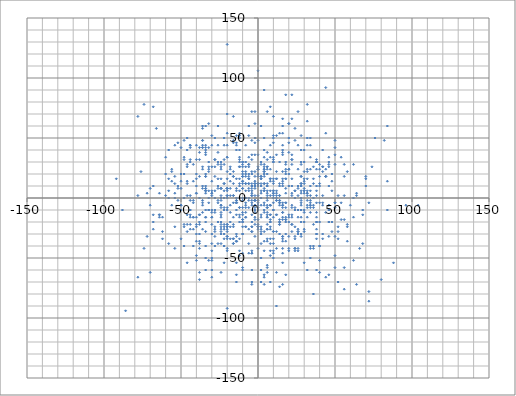
| Category | Series 0 |
|---|---|
| -16.0 | -4 |
| 6.0 | -22 |
| -34.0 | -28 |
| 16.0 | 22 |
| 2.0 | -6 |
| 26.0 | -16 |
| 6.0 | 24 |
| 46.0 | 30 |
| -32.0 | 42 |
| -38.0 | -38 |
| 0.0 | -6 |
| 16.0 | 66 |
| -30.0 | -44 |
| 30.0 | -20 |
| 2.0 | 6 |
| 24.0 | -44 |
| -72.0 | -32 |
| 16.0 | 16 |
| 28.0 | 12 |
| -20.0 | -8 |
| 50.0 | -4 |
| -30.0 | -10 |
| 14.0 | -4 |
| -2.0 | 10 |
| -10.0 | 12 |
| -20.0 | -26 |
| -40.0 | -24 |
| 22.0 | 10 |
| -8.0 | -4 |
| 4.0 | -72 |
| -20.0 | 34 |
| -8.0 | 30 |
| -2.0 | 62 |
| -8.0 | 0 |
| 28.0 | 6 |
| 36.0 | 16 |
| 8.0 | -14 |
| 16.0 | -42 |
| -34.0 | 18 |
| 8.0 | 34 |
| -8.0 | 26 |
| -58.0 | 40 |
| -46.0 | -54 |
| 16.0 | -46 |
| 40.0 | -52 |
| 24.0 | -42 |
| 52.0 | -28 |
| 18.0 | 8 |
| -28.0 | 26 |
| 38.0 | -4 |
| -14.0 | -4 |
| 8.0 | 16 |
| 4.0 | 24 |
| -34.0 | 18 |
| 70.0 | 16 |
| -10.0 | -20 |
| 18.0 | -4 |
| -14.0 | 46 |
| 4.0 | 6 |
| 2.0 | -26 |
| 28.0 | -16 |
| 16.0 | 54 |
| -2.0 | -10 |
| -46.0 | 2 |
| 38.0 | 30 |
| 18.0 | -64 |
| 8.0 | -18 |
| 38.0 | -60 |
| -12.0 | -44 |
| -58.0 | 6 |
| 24.0 | 0 |
| 28.0 | -30 |
| -46.0 | -28 |
| -10.0 | 30 |
| 34.0 | 44 |
| 20.0 | 50 |
| 4.0 | -4 |
| 50.0 | -4 |
| 46.0 | 10 |
| -62.0 | -34 |
| 10.0 | -4 |
| 16.0 | -12 |
| 14.0 | 2 |
| 50.0 | 48 |
| -38.0 | -14 |
| -20.0 | 22 |
| -2.0 | 50 |
| -20.0 | -42 |
| 54.0 | -4 |
| 30.0 | 14 |
| -26.0 | 30 |
| 14.0 | -2 |
| -6.0 | 52 |
| 30.0 | -10 |
| 10.0 | 32 |
| -30.0 | 14 |
| -18.0 | -6 |
| -48.0 | 34 |
| 10.0 | 34 |
| -6.0 | 26 |
| 50.0 | 36 |
| 26.0 | -28 |
| 28.0 | 52 |
| 24.0 | 6 |
| 46.0 | -32 |
| -40.0 | -30 |
| 28.0 | 18 |
| -12.0 | -20 |
| 40.0 | -40 |
| 12.0 | -90 |
| 72.0 | -86 |
| -26.0 | 38 |
| -8.0 | 0 |
| 56.0 | 2 |
| 44.0 | 18 |
| 22.0 | -22 |
| -64.0 | 4 |
| -38.0 | -14 |
| -44.0 | 42 |
| -2.0 | -12 |
| 30.0 | -12 |
| -40.0 | -52 |
| -34.0 | 40 |
| 20.0 | 20 |
| -32.0 | -10 |
| 30.0 | 40 |
| -4.0 | -4 |
| -12.0 | 16 |
| -4.0 | -24 |
| 16.0 | -54 |
| -40.0 | -22 |
| -2.0 | 46 |
| 0.0 | 24 |
| -4.0 | -6 |
| -26.0 | -38 |
| -22.0 | 0 |
| 20.0 | -44 |
| -14.0 | 16 |
| 8.0 | -20 |
| -4.0 | -46 |
| 12.0 | 36 |
| -68.0 | 10 |
| -14.0 | 40 |
| 82.0 | 48 |
| -20.0 | -24 |
| -50.0 | 20 |
| -4.0 | -2 |
| 88.0 | -54 |
| 44.0 | 24 |
| 10.0 | 0 |
| -24.0 | -14 |
| -52.0 | -2 |
| -14.0 | -4 |
| -10.0 | -30 |
| -20.0 | 16 |
| 16.0 | -16 |
| -10.0 | 14 |
| -32.0 | -4 |
| 32.0 | -8 |
| -40.0 | 20 |
| -12.0 | 32 |
| -6.0 | -38 |
| 12.0 | 52 |
| -8.0 | -24 |
| 16.0 | 60 |
| -14.0 | 8 |
| 36.0 | -6 |
| 14.0 | -22 |
| 10.0 | -46 |
| 0.0 | 12 |
| -4.0 | 2 |
| 16.0 | 10 |
| -2.0 | 36 |
| -16.0 | 18 |
| 44.0 | 18 |
| -48.0 | 0 |
| -14.0 | -30 |
| -36.0 | 60 |
| -34.0 | 10 |
| -6.0 | 12 |
| -16.0 | -24 |
| 28.0 | -10 |
| 2.0 | 30 |
| -32.0 | 24 |
| -60.0 | 20 |
| -6.0 | 28 |
| -12.0 | -16 |
| -22.0 | 6 |
| 10.0 | 14 |
| 84.0 | 60 |
| -24.0 | -12 |
| -42.0 | -16 |
| 38.0 | -12 |
| 36.0 | -22 |
| 68.0 | -14 |
| 8.0 | 44 |
| -20.0 | -34 |
| -22.0 | 0 |
| 14.0 | -20 |
| -44.0 | -14 |
| 16.0 | -32 |
| 4.0 | 6 |
| -64.0 | -16 |
| -28.0 | -32 |
| -40.0 | 44 |
| -4.0 | 10 |
| -4.0 | 6 |
| -38.0 | 32 |
| -34.0 | 6 |
| 58.0 | -24 |
| -42.0 | -16 |
| 14.0 | -74 |
| 26.0 | -28 |
| -48.0 | -40 |
| 46.0 | -64 |
| 6.0 | 0 |
| -10.0 | -2 |
| 42.0 | 40 |
| -36.0 | -4 |
| 22.0 | -22 |
| 46.0 | -10 |
| 58.0 | 22 |
| 18.0 | 16 |
| 42.0 | 26 |
| -24.0 | -20 |
| -10.0 | -30 |
| -46.0 | 50 |
| -4.0 | -14 |
| 30.0 | 4 |
| -24.0 | -6 |
| -4.0 | -70 |
| -46.0 | -14 |
| 12.0 | -28 |
| -4.0 | -24 |
| 4.0 | 8 |
| -34.0 | 38 |
| -10.0 | 18 |
| -36.0 | 42 |
| -12.0 | 54 |
| -42.0 | -4 |
| 6.0 | 10 |
| -40.0 | -36 |
| 6.0 | -6 |
| 16.0 | -18 |
| 28.0 | 4 |
| -40.0 | 10 |
| -62.0 | -28 |
| -12.0 | -8 |
| -18.0 | 2 |
| 10.0 | 68 |
| 24.0 | 58 |
| 22.0 | -14 |
| -16.0 | 46 |
| -28.0 | -12 |
| 44.0 | -66 |
| -60.0 | 2 |
| 20.0 | 10 |
| -24.0 | -2 |
| 8.0 | -48 |
| -14.0 | -10 |
| 8.0 | 6 |
| -34.0 | -20 |
| 32.0 | 22 |
| -12.0 | 12 |
| -28.0 | 32 |
| -6.0 | 16 |
| 16.0 | 38 |
| 14.0 | -6 |
| 14.0 | -20 |
| -70.0 | -62 |
| 14.0 | 54 |
| 18.0 | -20 |
| 12.0 | -2 |
| -18.0 | 26 |
| 8.0 | -34 |
| 6.0 | -62 |
| -30.0 | 4 |
| 8.0 | -6 |
| -22.0 | -8 |
| -20.0 | 8 |
| -24.0 | 8 |
| 32.0 | 4 |
| -36.0 | 8 |
| 34.0 | -6 |
| 26.0 | -10 |
| -12.0 | -8 |
| -10.0 | 20 |
| -20.0 | 54 |
| 24.0 | 6 |
| -14.0 | -36 |
| 24.0 | 0 |
| 4.0 | -12 |
| -14.0 | 44 |
| -6.0 | 18 |
| 8.0 | 24 |
| -12.0 | 50 |
| 16.0 | 14 |
| -70.0 | -6 |
| 4.0 | -10 |
| -22.0 | 12 |
| -52.0 | 46 |
| -12.0 | 34 |
| -38.0 | -22 |
| -50.0 | 14 |
| -2.0 | 22 |
| -10.0 | -18 |
| -54.0 | -42 |
| 72.0 | -78 |
| 50.0 | -48 |
| 48.0 | -28 |
| -8.0 | 18 |
| -20.0 | -92 |
| 12.0 | 16 |
| -28.0 | 18 |
| 42.0 | -4 |
| 50.0 | 28 |
| 6.0 | -12 |
| 46.0 | 28 |
| -64.0 | -14 |
| 6.0 | -8 |
| -2.0 | -18 |
| 26.0 | -26 |
| 46.0 | -10 |
| 16.0 | -34 |
| 34.0 | 50 |
| -28.0 | -24 |
| 2.0 | 16 |
| 38.0 | 32 |
| -34.0 | 44 |
| 28.0 | -32 |
| 4.0 | -44 |
| 20.0 | 38 |
| 12.0 | 22 |
| 10.0 | -16 |
| 26.0 | 10 |
| -24.0 | -62 |
| 20.0 | 62 |
| -32.0 | 30 |
| 2.0 | 16 |
| -28.0 | 50 |
| -24.0 | -28 |
| 24.0 | -10 |
| -12.0 | 40 |
| -54.0 | -24 |
| -10.0 | -24 |
| -38.0 | 38 |
| -18.0 | 20 |
| -12.0 | 26 |
| 34.0 | -2 |
| 14.0 | -22 |
| -22.0 | 12 |
| 8.0 | -44 |
| 32.0 | 4 |
| -2.0 | -8 |
| -18.0 | 8 |
| 36.0 | -40 |
| -18.0 | -24 |
| -50.0 | -34 |
| -8.0 | 12 |
| -46.0 | 26 |
| -2.0 | -2 |
| -22.0 | -30 |
| 6.0 | 2 |
| -24.0 | 8 |
| -62.0 | -16 |
| -20.0 | -10 |
| -30.0 | 26 |
| 38.0 | 10 |
| -8.0 | -12 |
| -10.0 | 30 |
| -48.0 | -22 |
| 0.0 | 20 |
| 8.0 | -26 |
| 30.0 | 6 |
| 6.0 | 26 |
| 2.0 | -24 |
| -24.0 | 16 |
| 12.0 | -14 |
| -14.0 | -70 |
| 48.0 | 20 |
| -66.0 | 58 |
| -10.0 | 22 |
| -6.0 | 28 |
| -24.0 | -8 |
| -36.0 | 10 |
| 38.0 | -20 |
| 22.0 | 66 |
| 30.0 | 12 |
| -20.0 | -24 |
| 6.0 | 32 |
| -12.0 | 10 |
| 64.0 | 4 |
| -22.0 | 32 |
| -4.0 | 12 |
| 2.0 | -30 |
| 10.0 | 16 |
| -16.0 | 48 |
| -6.0 | 6 |
| -10.0 | -18 |
| -20.0 | 70 |
| 62.0 | -52 |
| 42.0 | -30 |
| -10.0 | -58 |
| 2.0 | -60 |
| -2.0 | 8 |
| -4.0 | -28 |
| -58.0 | 0 |
| -34.0 | -50 |
| -8.0 | -6 |
| 62.0 | -16 |
| -44.0 | 30 |
| 2.0 | -50 |
| 30.0 | 16 |
| 56.0 | -58 |
| -30.0 | 2 |
| 38.0 | -16 |
| 56.0 | 18 |
| 28.0 | 0 |
| -2.0 | 12 |
| 84.0 | 14 |
| -30.0 | -38 |
| 6.0 | -2 |
| 34.0 | 2 |
| 14.0 | -2 |
| -44.0 | -16 |
| 4.0 | 90 |
| 0.0 | 36 |
| 44.0 | -12 |
| -68.0 | -26 |
| -20.0 | 34 |
| 16.0 | -32 |
| -4.0 | -20 |
| 14.0 | 30 |
| 36.0 | -80 |
| -56.0 | 22 |
| 18.0 | 20 |
| -26.0 | 44 |
| 18.0 | -36 |
| -24.0 | -26 |
| -56.0 | 24 |
| 6.0 | -16 |
| 34.0 | 6 |
| 0.0 | -8 |
| 14.0 | 2 |
| 28.0 | 30 |
| 0.0 | -18 |
| -2.0 | -32 |
| -36.0 | 26 |
| 24.0 | -42 |
| 6.0 | 4 |
| 6.0 | -16 |
| 62.0 | 28 |
| 64.0 | 2 |
| -6.0 | 8 |
| -24.0 | 2 |
| 10.0 | 46 |
| -28.0 | -26 |
| -12.0 | 52 |
| 0.0 | 26 |
| 64.0 | -72 |
| -50.0 | 8 |
| 34.0 | 24 |
| 0.0 | 18 |
| -4.0 | -72 |
| -10.0 | 26 |
| 26.0 | 8 |
| -8.0 | 0 |
| -34.0 | 6 |
| -16.0 | 18 |
| 2.0 | -38 |
| 28.0 | 10 |
| -60.0 | 34 |
| 32.0 | 2 |
| 30.0 | 8 |
| 0.0 | 24 |
| 22.0 | 86 |
| 4.0 | 12 |
| -34.0 | 8 |
| 4.0 | -66 |
| -10.0 | 18 |
| -20.0 | 8 |
| 26.0 | 44 |
| 38.0 | -30 |
| 8.0 | -20 |
| 0.0 | 10 |
| 30.0 | -54 |
| -2.0 | -2 |
| -52.0 | 10 |
| -32.0 | -10 |
| -2.0 | 2 |
| 10.0 | 2 |
| 52.0 | -24 |
| 6.0 | 6 |
| 22.0 | -16 |
| -18.0 | -12 |
| -34.0 | 60 |
| -14.0 | -4 |
| 18.0 | 22 |
| 22.0 | 36 |
| -36.0 | 24 |
| -12.0 | 0 |
| -12.0 | -48 |
| -36.0 | -2 |
| 10.0 | -34 |
| 32.0 | 64 |
| 40.0 | 24 |
| -32.0 | 22 |
| 6.0 | -8 |
| 10.0 | 6 |
| 26.0 | -44 |
| -16.0 | 2 |
| -14.0 | -2 |
| 4.0 | 22 |
| 58.0 | -36 |
| 16.0 | -72 |
| -44.0 | 32 |
| -16.0 | 2 |
| -14.0 | 6 |
| -74.0 | 78 |
| -46.0 | 14 |
| -34.0 | -16 |
| -34.0 | -60 |
| -26.0 | 16 |
| 32.0 | -2 |
| 54.0 | -18 |
| 16.0 | -8 |
| -36.0 | 44 |
| 32.0 | -60 |
| 48.0 | -20 |
| -24.0 | -30 |
| -22.0 | -26 |
| -4.0 | 20 |
| -8.0 | -24 |
| 4.0 | 28 |
| 10.0 | 4 |
| -26.0 | -4 |
| -20.0 | 44 |
| -52.0 | 8 |
| 30.0 | 30 |
| -50.0 | -10 |
| 32.0 | 16 |
| 50.0 | -58 |
| -6.0 | 12 |
| -12.0 | -34 |
| -44.0 | 2 |
| 22.0 | -8 |
| -46.0 | 28 |
| -34.0 | -16 |
| 12.0 | 6 |
| -14.0 | 0 |
| -28.0 | 6 |
| 58.0 | -22 |
| -44.0 | -2 |
| -16.0 | -38 |
| 12.0 | 0 |
| -10.0 | -20 |
| 46.0 | -6 |
| -2.0 | -22 |
| 38.0 | 30 |
| 42.0 | 22 |
| 68.0 | -10 |
| 2.0 | -28 |
| -44.0 | -26 |
| 6.0 | -34 |
| -30.0 | -30 |
| -78.0 | -66 |
| 30.0 | 22 |
| -2.0 | 12 |
| 18.0 | -18 |
| 44.0 | 92 |
| 36.0 | -8 |
| -26.0 | 8 |
| 12.0 | -62 |
| 28.0 | 28 |
| -40.0 | 4 |
| 34.0 | -12 |
| 0.0 | -26 |
| 12.0 | -2 |
| -6.0 | -2 |
| -24.0 | -24 |
| -16.0 | -34 |
| 42.0 | 26 |
| -4.0 | -28 |
| -2.0 | -6 |
| 42.0 | -6 |
| 34.0 | -40 |
| 18.0 | -18 |
| -38.0 | 0 |
| 12.0 | -14 |
| -22.0 | 50 |
| -68.0 | -14 |
| 20.0 | 24 |
| 2.0 | 28 |
| 68.0 | -38 |
| 10.0 | 52 |
| -22.0 | -40 |
| -34.0 | -10 |
| -48.0 | 20 |
| 44.0 | 18 |
| 18.0 | -8 |
| -16.0 | -16 |
| 10.0 | -28 |
| 20.0 | 24 |
| -12.0 | 30 |
| -38.0 | -30 |
| 22.0 | 4 |
| 2.0 | 4 |
| -46.0 | -22 |
| 34.0 | -4 |
| -88.0 | -10 |
| 40.0 | -4 |
| -14.0 | -36 |
| 22.0 | 32 |
| 18.0 | 86 |
| -54.0 | 12 |
| -54.0 | 44 |
| -34.0 | 4 |
| -44.0 | -10 |
| 36.0 | 0 |
| 42.0 | 2 |
| 12.0 | 2 |
| 34.0 | -50 |
| 8.0 | 14 |
| 40.0 | 10 |
| 24.0 | -24 |
| 56.0 | -18 |
| 74.0 | 26 |
| 4.0 | -36 |
| 14.0 | -18 |
| -78.0 | 68 |
| -2.0 | 10 |
| -20.0 | -32 |
| -10.0 | -14 |
| 46.0 | 34 |
| -8.0 | -16 |
| 38.0 | 24 |
| 30.0 | 6 |
| 24.0 | -32 |
| 32.0 | 6 |
| 38.0 | 6 |
| 6.0 | 38 |
| 26.0 | 2 |
| -34.0 | 6 |
| -42.0 | -26 |
| -14.0 | -64 |
| -42.0 | -40 |
| 40.0 | 12 |
| -26.0 | -2 |
| 4.0 | 34 |
| 2.0 | 10 |
| 40.0 | -62 |
| -22.0 | -54 |
| -28.0 | 0 |
| -50.0 | -6 |
| 34.0 | 10 |
| 0.0 | -10 |
| -2.0 | 72 |
| 28.0 | 12 |
| 38.0 | -30 |
| 40.0 | -40 |
| -24.0 | 0 |
| -30.0 | -16 |
| 14.0 | -30 |
| -56.0 | 14 |
| 8.0 | -70 |
| -22.0 | -10 |
| 36.0 | -42 |
| 28.0 | -6 |
| -10.0 | 8 |
| 4.0 | 18 |
| -4.0 | 10 |
| 42.0 | -34 |
| 70.0 | 10 |
| 28.0 | 40 |
| 44.0 | 54 |
| 26.0 | 24 |
| 18.0 | 24 |
| -28.0 | -28 |
| -16.0 | -22 |
| 0.0 | -2 |
| -58.0 | -38 |
| -30.0 | -12 |
| 24.0 | -8 |
| 20.0 | -14 |
| -8.0 | 12 |
| 0.0 | -4 |
| 76.0 | 50 |
| 26.0 | -30 |
| -30.0 | 52 |
| -46.0 | 12 |
| 4.0 | -28 |
| 0.0 | -22 |
| 14.0 | 10 |
| 8.0 | -14 |
| 16.0 | 40 |
| 48.0 | 6 |
| -36.0 | -6 |
| -38.0 | -68 |
| -22.0 | -22 |
| -36.0 | -26 |
| 32.0 | 78 |
| 4.0 | 12 |
| -18.0 | 24 |
| -36.0 | 48 |
| -32.0 | 62 |
| 32.0 | -16 |
| 18.0 | 16 |
| 20.0 | -32 |
| -16.0 | 22 |
| 32.0 | 44 |
| -8.0 | 20 |
| 4.0 | 40 |
| -16.0 | -34 |
| 46.0 | -20 |
| 10.0 | 6 |
| 18.0 | -4 |
| -30.0 | -52 |
| -28.0 | 32 |
| -30.0 | -16 |
| 50.0 | -32 |
| -10.0 | 14 |
| 52.0 | -34 |
| 6.0 | 20 |
| 50.0 | 42 |
| -14.0 | -36 |
| -4.0 | 2 |
| -30.0 | 4 |
| -92.0 | 16 |
| -20.0 | -22 |
| 34.0 | -8 |
| -8.0 | 44 |
| -2.0 | -2 |
| -24.0 | 30 |
| 6.0 | -26 |
| -42.0 | -2 |
| -6.0 | 16 |
| -40.0 | -48 |
| -30.0 | -50 |
| -10.0 | -60 |
| -44.0 | -10 |
| -68.0 | 76 |
| 8.0 | 76 |
| 2.0 | -16 |
| 50.0 | -8 |
| 0.0 | 2 |
| -46.0 | 40 |
| 4.0 | -64 |
| -8.0 | -16 |
| 10.0 | -38 |
| -4.0 | -46 |
| -4.0 | -44 |
| 16.0 | -6 |
| -14.0 | -14 |
| 24.0 | -34 |
| 18.0 | 28 |
| -2.0 | 18 |
| 6.0 | 26 |
| 18.0 | -30 |
| 32.0 | 24 |
| -16.0 | 12 |
| 8.0 | -6 |
| 38.0 | -34 |
| 56.0 | 28 |
| 22.0 | 32 |
| -74.0 | -42 |
| 10.0 | -10 |
| 0.0 | -24 |
| -4.0 | 48 |
| 20.0 | -16 |
| -30.0 | -60 |
| -10.0 | 18 |
| 4.0 | 22 |
| 66.0 | -42 |
| 22.0 | -28 |
| -14.0 | -32 |
| -44.0 | 44 |
| 28.0 | -20 |
| 28.0 | -2 |
| 60.0 | -6 |
| -40.0 | 32 |
| -70.0 | 8 |
| 22.0 | 2 |
| -12.0 | 6 |
| -40.0 | 16 |
| 38.0 | -26 |
| -72.0 | 4 |
| -38.0 | -20 |
| -8.0 | -8 |
| -6.0 | -26 |
| -12.0 | 26 |
| -2.0 | -6 |
| -20.0 | 8 |
| 46.0 | 26 |
| -34.0 | 8 |
| -48.0 | -24 |
| 16.0 | 36 |
| 72.0 | -4 |
| 48.0 | 14 |
| -20.0 | -32 |
| 6.0 | -56 |
| -56.0 | -6 |
| -64.0 | -14 |
| -42.0 | 14 |
| -4.0 | 22 |
| 20.0 | 24 |
| 16.0 | -12 |
| 4.0 | -6 |
| 40.0 | 18 |
| -48.0 | 48 |
| 20.0 | 62 |
| 10.0 | 30 |
| 12.0 | 4 |
| -20.0 | 2 |
| 54.0 | 34 |
| 20.0 | 46 |
| 14.0 | 12 |
| -18.0 | 14 |
| 4.0 | 24 |
| -26.0 | 60 |
| 2.0 | 18 |
| -40.0 | 4 |
| -26.0 | 10 |
| -50.0 | 42 |
| 46.0 | -6 |
| 10.0 | -10 |
| -2.0 | 14 |
| -20.0 | 0 |
| 4.0 | 26 |
| -28.0 | -10 |
| -20.0 | -22 |
| -38.0 | -36 |
| 26.0 | 72 |
| -20.0 | 128 |
| 20.0 | -20 |
| 10.0 | -28 |
| -6.0 | -46 |
| -12.0 | -14 |
| 28.0 | -4 |
| 22.0 | 28 |
| -10.0 | 28 |
| 34.0 | -42 |
| -68.0 | -20 |
| -24.0 | 28 |
| -30.0 | 6 |
| 30.0 | -26 |
| -10.0 | 8 |
| 104.0 | -6 |
| -42.0 | 28 |
| 2.0 | -70 |
| 80.0 | -68 |
| 0.0 | 106 |
| 24.0 | 48 |
| -54.0 | 18 |
| -6.0 | 34 |
| 36.0 | 12 |
| 34.0 | -6 |
| 8.0 | 16 |
| -48.0 | 32 |
| -2.0 | -16 |
| 20.0 | -42 |
| -22.0 | -34 |
| 6.0 | 12 |
| 6.0 | 10 |
| 8.0 | -6 |
| -6.0 | 60 |
| 0.0 | -42 |
| -24.0 | 8 |
| -32.0 | 6 |
| -38.0 | 18 |
| -10.0 | 0 |
| -14.0 | -4 |
| 16.0 | -4 |
| 40.0 | 28 |
| -6.0 | -8 |
| 0.0 | 12 |
| 22.0 | 16 |
| -86.0 | -94 |
| 62.0 | 0 |
| -22.0 | -40 |
| -28.0 | -40 |
| -32.0 | -52 |
| 18.0 | 4 |
| 4.0 | 20 |
| 38.0 | -20 |
| 28.0 | 18 |
| 18.0 | -16 |
| 10.0 | -50 |
| -4.0 | 36 |
| -20.0 | 6 |
| -20.0 | -44 |
| -34.0 | 42 |
| -26.0 | 28 |
| -34.0 | -40 |
| -18.0 | -34 |
| 10.0 | 30 |
| 0.0 | 12 |
| -54.0 | 4 |
| 2.0 | 18 |
| 52.0 | 2 |
| 70.0 | 18 |
| 0.0 | 48 |
| -18.0 | -20 |
| -10.0 | -46 |
| -38.0 | -42 |
| -54.0 | 0 |
| -22.0 | -24 |
| -36.0 | 42 |
| 2.0 | -14 |
| -14.0 | -2 |
| 6.0 | -58 |
| 12.0 | -42 |
| 84.0 | -10 |
| 36.0 | 26 |
| -4.0 | -60 |
| -34.0 | 20 |
| -78.0 | 2 |
| 26.0 | -42 |
| 32.0 | -6 |
| 56.0 | -76 |
| -20.0 | -28 |
| -24.0 | -6 |
| -16.0 | -38 |
| -20.0 | 8 |
| -24.0 | -16 |
| 16.0 | -6 |
| 16.0 | 12 |
| 8.0 | -24 |
| -38.0 | -62 |
| -24.0 | 26 |
| -30.0 | 44 |
| 12.0 | 16 |
| 28.0 | 10 |
| -20.0 | 2 |
| 52.0 | -70 |
| -24.0 | 24 |
| -22.0 | 28 |
| 10.0 | 4 |
| -50.0 | -6 |
| 2.0 | 0 |
| -24.0 | -38 |
| -14.0 | -54 |
| 18.0 | 30 |
| 0.0 | -24 |
| -10.0 | -12 |
| 14.0 | -4 |
| -36.0 | 58 |
| 8.0 | 2 |
| -30.0 | -66 |
| 28.0 | -10 |
| 38.0 | 2 |
| 22.0 | -6 |
| -10.0 | -8 |
| 30.0 | -28 |
| 6.0 | -36 |
| -8.0 | 22 |
| 2.0 | 12 |
| 8.0 | -38 |
| -26.0 | -20 |
| -44.0 | 44 |
| -32.0 | 0 |
| 96.0 | -6 |
| 4.0 | 50 |
| -30.0 | -22 |
| 10.0 | 50 |
| -4.0 | 72 |
| -4.0 | 32 |
| 38.0 | 30 |
| -32.0 | 26 |
| 46.0 | -20 |
| 16.0 | 44 |
| -76.0 | 22 |
| 2.0 | 60 |
| 40.0 | -20 |
| -36.0 | -12 |
| -44.0 | -22 |
| 16.0 | -36 |
| 0.0 | 24 |
| -4.0 | 8 |
| -16.0 | 68 |
| -8.0 | 6 |
| -24.0 | -22 |
| 6.0 | -14 |
| 0.0 | -24 |
| -58.0 | 16 |
| -4.0 | 4 |
| -14.0 | 52 |
| -40.0 | -16 |
| -6.0 | 0 |
| 10.0 | 12 |
| -36.0 | 48 |
| -38.0 | 42 |
| 32.0 | 50 |
| 6.0 | -26 |
| -34.0 | 36 |
| 10.0 | -44 |
| -6.0 | 20 |
| 0.0 | -10 |
| -22.0 | 44 |
| 6.0 | 72 |
| 34.0 | 34 |